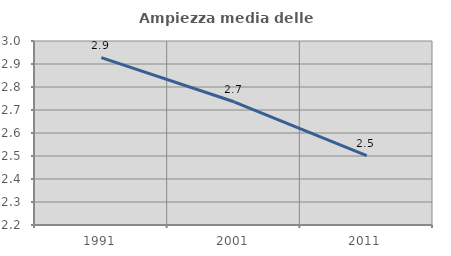
| Category | Ampiezza media delle famiglie |
|---|---|
| 1991.0 | 2.928 |
| 2001.0 | 2.736 |
| 2011.0 | 2.502 |